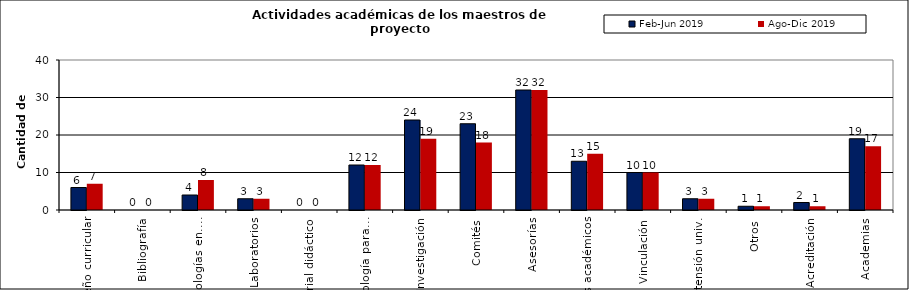
| Category | Feb-Jun 2019 | Ago-Dic 2019 |
|---|---|---|
| Diseño curricular | 6 | 7 |
| Bibliografía | 0 | 0 |
| Metodologías en.... | 4 | 8 |
| Laboratorios | 3 | 3 |
| Material didáctico | 0 | 0 |
| Metodología para... | 12 | 12 |
| Investigación | 24 | 19 |
| Comités | 23 | 18 |
| Asesorías | 32 | 32 |
| Clubs académicos | 13 | 15 |
| Vinculación | 10 | 10 |
| Extensión univ. | 3 | 3 |
| Otros | 1 | 1 |
| Acreditación | 2 | 1 |
| Academias | 19 | 17 |